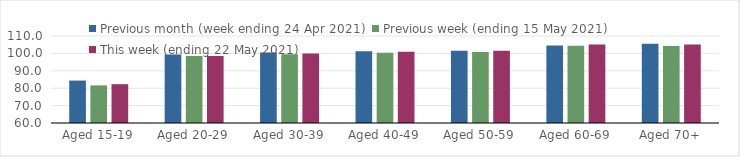
| Category | Previous month (week ending 24 Apr 2021) | Previous week (ending 15 May 2021) | This week (ending 22 May 2021) |
|---|---|---|---|
| Aged 15-19 | 84.38 | 81.63 | 82.32 |
| Aged 20-29 | 99.42 | 98.44 | 98.46 |
| Aged 30-39 | 100.45 | 99.57 | 99.93 |
| Aged 40-49 | 101.22 | 100.31 | 100.99 |
| Aged 50-59 | 101.58 | 100.77 | 101.59 |
| Aged 60-69 | 104.49 | 104.45 | 105.17 |
| Aged 70+ | 105.53 | 104.29 | 105.15 |